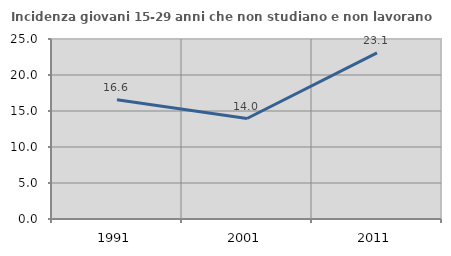
| Category | Incidenza giovani 15-29 anni che non studiano e non lavorano  |
|---|---|
| 1991.0 | 16.571 |
| 2001.0 | 13.953 |
| 2011.0 | 23.077 |